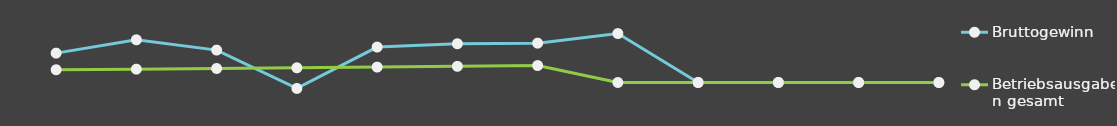
| Category | Bruttogewinn | Betriebsausgaben gesamt |
|---|---|---|
| 0 | 25000 | 10841 |
| 1 | 36348 | 11367.25 |
| 2 | 27562 | 11919.82 |
| 3 | -5059.5 | 12500.01 |
| 4 | 30153.18 | 13109.21 |
| 5 | 32964.45 | 13748.86 |
| 6 | 33502.87 | 14420.51 |
| 7 | 41646 | 0 |
| 8 | 0 | 0 |
| 9 | 0 | 0 |
| 10 | 0 | 0 |
| 11 | 0 | 0 |